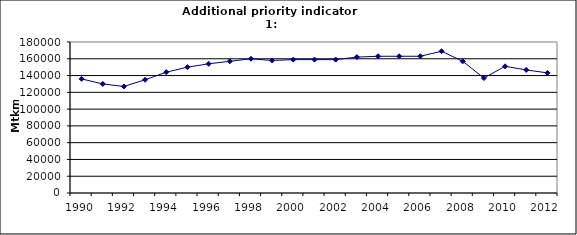
| Category | Freight transport on road, Mtkm |
|---|---|
| 1990 | 136000 |
| 1991 | 130000 |
| 1992 | 127000 |
| 1993 | 135000 |
| 1994 | 144000 |
| 1995 | 150000 |
| 1996 | 154000 |
| 1997 | 157000 |
| 1998 | 160000 |
| 1999 | 158000 |
| 2000 | 159000 |
| 2001 | 159000 |
| 2002 | 159000 |
| 2003 | 162000 |
| 2004 | 163000 |
| 2005 | 163000 |
| 2006 | 163000 |
| 2007 | 169000 |
| 2008 | 157000 |
| 2009 | 137000 |
| 2010 | 151000 |
| 2011 | 146733.342 |
| 2012 | 143166.761 |